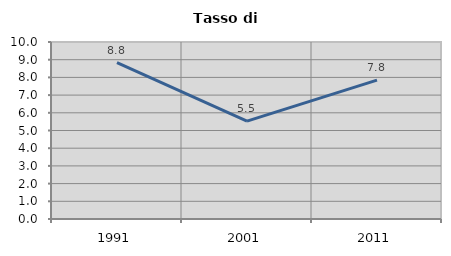
| Category | Tasso di disoccupazione   |
|---|---|
| 1991.0 | 8.836 |
| 2001.0 | 5.533 |
| 2011.0 | 7.846 |